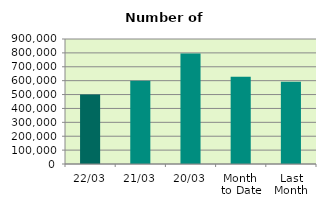
| Category | Series 0 |
|---|---|
| 22/03 | 501238 |
| 21/03 | 599824 |
| 20/03 | 795660 |
| Month 
to Date | 627495.875 |
| Last
Month | 592303 |